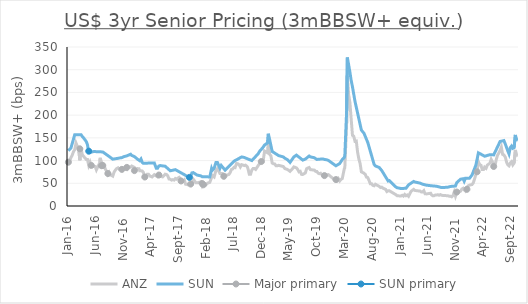
| Category | ANZ | SUN |
|---|---|---|
| 2022-10-13 | 111.5 | 145.5 |
| 2022-10-06 | 112 | 146 |
| 2022-09-29 | 123.5 | 156.5 |
| 2022-09-22 | 94.5 | 128.5 |
| 2022-09-15 | 90.5 | 127 |
| 2022-09-08 | 97.5 | 132 |
| 2022-09-01 | 94.5 | 128.5 |
| 2022-08-25 | 88.5 | 114.5 |
| 2022-08-19 | 90.5 | 120.5 |
| 2022-08-12 | 96.23 | 128.333 |
| 2022-08-05 | 107.235 | 136.167 |
| 2022-07-28 | 112.411 | 144 |
| 2022-07-21 | 113.66 | 143.333 |
| 2022-07-14 | 129.53 | 142.667 |
| 2022-07-07 | 122.306 | 142 |
| 2022-06-30 | 116.43 | 136.1 |
| 2022-06-23 | 111.567 | 130.2 |
| 2022-06-16 | 102.236 | 124.3 |
| 2022-06-09 | 88.68 | 118.4 |
| 2022-06-02 | 89.247 | 112.5 |
| 2022-05-26 | 97.351 | 112.667 |
| 2022-05-19 | 102.64 | 112.833 |
| 2022-05-12 | 94.336 | 113 |
| 2022-05-05 | 92.039 | 112.125 |
| 2022-04-28 | 89.977 | 111.25 |
| 2022-04-21 | 82.906 | 110.375 |
| 2022-04-13 | 85.495 | 109.5 |
| 2022-04-07 | 80.136 | 111 |
| 2022-03-31 | 80.12 | 112.5 |
| 2022-03-24 | 89.747 | 114 |
| 2022-03-17 | 90.981 | 115.5 |
| 2022-03-10 | 97.451 | 117 |
| 2022-03-03 | 77.386 | 103.5 |
| 2022-02-24 | 69.743 | 90 |
| 2022-02-17 | 59.656 | 82.75 |
| 2022-02-10 | 51.031 | 75.5 |
| 2022-02-03 | 47.225 | 68.25 |
| 2022-01-20 | 45.949 | 61 |
| 2022-01-13 | 44.47 | 61 |
| 2022-01-06 | 39.098 | 61 |
| 2021-12-29 | 32.897 | 61 |
| 2021-12-22 | 35.407 | 54.5 |
| 2021-12-16 | 39.077 | 60 |
| 2021-12-09 | 37.412 | 59.5 |
| 2021-12-02 | 32.64 | 59 |
| 2021-11-11 | 29.997 | 51.5 |
| 2021-11-04 | 21.493 | 44 |
| 2021-10-28 | 30.612 | 43.75 |
| 2021-10-21 | 22.809 | 43.5 |
| 2021-10-14 | 20.268 | 43.25 |
| 2021-10-07 | 21.584 | 43 |
| 2021-09-30 | 21.598 | 42.167 |
| 2021-09-23 | 22.561 | 41.333 |
| 2021-08-20 | 23.492 | 40.5 |
| 2021-08-13 | 25.074 | 41.25 |
| 2021-08-06 | 23.649 | 42 |
| 2021-07-30 | 24.726 | 42.75 |
| 2021-07-23 | 24.246 | 43.5 |
| 2021-07-16 | 24.024 | 43.75 |
| 2021-07-09 | 22.764 | 44 |
| 2021-07-02 | 22.481 | 44.25 |
| 2021-06-25 | 24.837 | 44.5 |
| 2021-06-21 | 28.038 | 45.2 |
| 2021-05-28 | 26.635 | 45.9 |
| 2021-05-21 | 26.797 | 46.6 |
| 2021-05-14 | 33.723 | 47.3 |
| 2021-05-07 | 30.733 | 48 |
| 2021-04-30 | 30.996 | 49.2 |
| 2021-04-23 | 32.894 | 50.4 |
| 2021-04-09 | 33.453 | 51.6 |
| 2021-03-26 | 34.278 | 52.8 |
| 2021-03-19 | 36.581 | 54 |
| 2021-03-05 | 32.237 | 50.25 |
| 2021-02-19 | 21.364 | 46.5 |
| 2021-02-12 | 24.185 | 42.75 |
| 2021-02-05 | 22.551 | 39 |
| 2021-01-29 | 25.343 | 38.875 |
| 2021-01-22 | 21.836 | 38.75 |
| 2021-01-15 | 23.517 | 38.625 |
| 2021-01-08 | 21.853 | 38.5 |
| 2020-12-18 | 22.708 | 40.25 |
| 2020-12-11 | 24.951 | 42 |
| 2020-11-06 | 33.43 | 56 |
| 2020-10-30 | 33.501 | 55 |
| 2020-10-23 | 31.836 | 59.6 |
| 2020-10-16 | 36.739 | 64.2 |
| 2020-10-09 | 37.934 | 68.8 |
| 2020-10-02 | 39.058 | 73.4 |
| 2020-09-25 | 41.4 | 78 |
| 2020-09-18 | 40.681 | 81.375 |
| 2020-09-11 | 43.175 | 84.75 |
| 2020-08-21 | 47.86 | 88.125 |
| 2020-08-14 | 44.53 | 91.5 |
| 2020-08-07 | 45.436 | 101.2 |
| 2020-07-31 | 49.094 | 110.9 |
| 2020-07-24 | 49.075 | 120.6 |
| 2020-07-17 | 56.249 | 130.3 |
| 2020-07-10 | 62.584 | 140 |
| 2020-07-03 | 63.613 | 146.75 |
| 2020-06-26 | 69.815 | 153.5 |
| 2020-06-19 | 72.21 | 160.25 |
| 2020-06-05 | 75.121 | 167 |
| 2020-05-29 | 93.327 | 179.6 |
| 2020-05-22 | 103.639 | 192.2 |
| 2020-05-15 | 118.974 | 204.8 |
| 2020-05-08 | 143.024 | 217.4 |
| 2020-05-01 | 142.389 | 230 |
| 2020-04-24 | 153.498 | 246.167 |
| 2020-04-17 | 155.564 | 262.333 |
| 2020-04-09 | 196.23 | 278.5 |
| 2020-04-03 | 227.506 | 294.667 |
| 2020-03-27 | 244.914 | 310.833 |
| 2020-03-20 | 286.298 | 327 |
| 2020-03-16 | 182.746 | 210 |
| 2020-03-06 | 84.379 | 111 |
| 2020-03-03 | 81.771 | 106.625 |
| 2020-02-21 | 60.464 | 102.25 |
| 2020-02-14 | 58.665 | 97.875 |
| 2020-02-07 | 55.168 | 93.5 |
| 2020-01-31 | 59.918 | 91.833 |
| 2020-01-24 | 55.152 | 90.167 |
| 2020-01-17 | 55.512 | 88.5 |
| 2019-12-06 | 69.173 | 100.5 |
| 2019-11-29 | 68.832 | 101.5 |
| 2019-11-15 | 67.488 | 102.5 |
| 2019-11-08 | 65.753 | 103.5 |
| 2019-10-25 | 72.058 | 103.25 |
| 2019-10-18 | 71.11 | 103 |
| 2019-10-11 | 72.348 | 102.75 |
| 2019-10-04 | 76.114 | 102.5 |
| 2019-09-27 | 76.211 | 104.375 |
| 2019-09-20 | 79.042 | 106.25 |
| 2019-08-30 | 80.035 | 108.125 |
| 2019-08-23 | 84.67 | 110 |
| 2019-08-16 | 83.591 | 107.75 |
| 2019-08-09 | 82.035 | 105.5 |
| 2019-08-02 | 72.857 | 103.25 |
| 2019-07-19 | 69.426 | 101 |
| 2019-07-12 | 69.601 | 103.2 |
| 2019-07-05 | 76.269 | 105.4 |
| 2019-06-28 | 75.221 | 107.6 |
| 2019-06-21 | 80.491 | 109.8 |
| 2019-06-14 | 83.879 | 112 |
| 2019-05-31 | 86.092 | 108 |
| 2019-05-24 | 82.434 | 104 |
| 2019-05-17 | 79.151 | 100 |
| 2019-05-10 | 76.311 | 96 |
| 2019-04-26 | 80.352 | 102 |
| 2019-04-12 | 82.233 | 105 |
| 2019-04-03 | 86.911 | 108 |
| 2019-03-08 | 89.5 | 111 |
| 2019-03-01 | 88.5 | 112.8 |
| 2019-02-22 | 88.541 | 114.6 |
| 2019-02-15 | 92.432 | 116.4 |
| 2019-02-08 | 93 | 118.2 |
| 2019-02-01 | 94.5 | 120 |
| 2019-01-25 | 110 | 133 |
| 2019-01-18 | 114.5 | 146 |
| 2019-01-11 | 137 | 159 |
| 2019-01-07 | 117 | 139 |
| 2018-12-21 | 121 | 134.2 |
| 2018-12-13 | 98 | 129.4 |
| 2018-12-03 | 99 | 124.6 |
| 2018-11-23 | 93 | 120 |
| 2018-11-16 | 89 | 115 |
| 2018-11-02 | 80.5 | 109 |
| 2018-10-26 | 82.5 | 106 |
| 2018-10-19 | 82.5 | 103 |
| 2018-10-12 | 79 | 100 |
| 2018-10-05 | 70 | 101.143 |
| 2018-09-28 | 70 | 102.286 |
| 2018-09-21 | 82 | 103.429 |
| 2018-09-17 | 86.5 | 104.571 |
| 2018-09-07 | 90 | 105.714 |
| 2018-08-31 | 89 | 106.857 |
| 2018-08-17 | 91 | 108 |
| 2018-08-10 | 86 | 106.417 |
| 2018-08-03 | 91 | 104.833 |
| 2018-07-27 | 93 | 103.25 |
| 2018-07-20 | 93.5 | 101.667 |
| 2018-07-12 | 84.5 | 100.083 |
| 2018-07-06 | 85 | 98.5 |
| 2018-06-29 | 81.5 | 95.714 |
| 2018-06-22 | 80.5 | 92.929 |
| 2018-06-15 | 73.5 | 90.143 |
| 2018-06-08 | 69.5 | 87.357 |
| 2018-06-01 | 68.5 | 84.571 |
| 2018-05-25 | 68.5 | 81.786 |
| 2018-05-18 | 67 | 79 |
| 2018-05-11 | 68 | 82.4 |
| 2018-05-04 | 71.5 | 85.8 |
| 2018-04-27 | 71.5 | 89.2 |
| 2018-04-20 | 71.5 | 83 |
| 2018-04-06 | 82.5 | 96 |
| 2018-03-29 | 78.5 | 96 |
| 2018-03-19 | 64 | 83.2 |
| 2018-03-09 | 67.5 | 78.5 |
| 2018-03-05 | 63 | 82.5 |
| 2018-02-23 | 52 | 64 |
| 2018-02-12 | 50.5 | 64.125 |
| 2018-02-02 | 47 | 64.25 |
| 2018-01-19 | 51 | 64.375 |
| 2018-01-12 | 45 | 64.5 |
| 2018-01-05 | 53 | 66.3 |
| 2017-12-15 | 51 | 68.1 |
| 2017-12-08 | 51 | 69.9 |
| 2017-12-01 | 55.5 | 71.7 |
| 2017-11-24 | 59 | 73.5 |
| 2017-11-17 | 49.5 | 72.857 |
| 2017-11-10 | 45 | 65 |
| 2017-11-03 | 46.5 | 61.5 |
| 2017-10-27 | 46.5 | 64 |
| 2017-10-20 | 47.5 | 65.667 |
| 2017-10-13 | 48 | 67.333 |
| 2017-10-06 | 57.5 | 69 |
| 2017-09-29 | 55 | 70.571 |
| 2017-09-22 | 56 | 72.143 |
| 2017-09-18 | 56 | 73.714 |
| 2017-09-08 | 63 | 75.286 |
| 2017-09-01 | 61.5 | 76.857 |
| 2017-08-25 | 59 | 78.429 |
| 2017-08-18 | 60.5 | 80 |
| 2017-08-11 | 57 | 79.375 |
| 2017-08-04 | 58 | 78.75 |
| 2017-07-28 | 57 | 78.125 |
| 2017-07-21 | 59 | 77.5 |
| 2017-07-14 | 59.5 | 80 |
| 2017-07-07 | 66.5 | 82.5 |
| 2017-06-30 | 69.5 | 85 |
| 2017-06-23 | 70 | 87.5 |
| 2017-06-16 | 67 | 87.875 |
| 2017-06-09 | 64 | 88.25 |
| 2017-06-02 | 65 | 88.625 |
| 2017-05-26 | 70.5 | 89 |
| 2017-05-19 | 68 | 88 |
| 2017-05-12 | 64.5 | 83 |
| 2017-05-05 | 66 | 83 |
| 2017-04-24 | 69 | 94.889 |
| 2017-04-12 | 64 | 94.778 |
| 2017-04-07 | 64 | 94.667 |
| 2017-03-31 | 66 | 94.556 |
| 2017-03-23 | 70 | 94.444 |
| 2017-03-17 | 70 | 94.333 |
| 2017-03-10 | 63.5 | 94.222 |
| 2017-03-03 | 62.5 | 94.111 |
| 2017-02-23 | 74 | 94 |
| 2017-02-17 | 77 | 95.9 |
| 2017-02-10 | 77.5 | 103.5 |
| 2017-02-03 | 77.5 | 99.7 |
| 2017-01-30 | 82 | 101.6 |
| 2017-01-20 | 82.5 | 103.5 |
| 2017-01-13 | 79 | 106.125 |
| 2017-01-05 | 85 | 108.75 |
| 2016-12-21 | 88 | 111.375 |
| 2016-12-15 | 85.5 | 114 |
| 2016-12-08 | 86 | 112.75 |
| 2016-12-01 | 87 | 111.5 |
| 2016-11-24 | 80 | 110.25 |
| 2016-11-11 | 81 | 109 |
| 2016-11-03 | 80.1 | 107.75 |
| 2016-10-28 | 83 | 106.5 |
| 2016-10-20 | 83 | 106 |
| 2016-10-13 | 81.437 | 105.5 |
| 2016-10-07 | 84 | 105 |
| 2016-09-29 | 82.299 | 104.5 |
| 2016-09-22 | 78.898 | 104 |
| 2016-09-15 | 74.426 | 103.5 |
| 2016-09-08 | 65.782 | 103 |
| 2016-09-01 | 67.406 | 105 |
| 2016-08-26 | 68.506 | 107 |
| 2016-08-19 | 74 | 109 |
| 2016-08-12 | 69.517 | 111 |
| 2016-08-05 | 76.447 | 113 |
| 2016-07-29 | 81.134 | 115 |
| 2016-07-22 | 90.479 | 117 |
| 2016-07-15 | 89 | 119 |
| 2016-07-08 | 96.5 | 119.125 |
| 2016-07-01 | 106 | 119.25 |
| 2016-06-29 | 95.524 | 119.375 |
| 2016-06-17 | 85.5 | 119.5 |
| 2016-06-10 | 79.5 | 119.625 |
| 2016-06-03 | 87 | 119.75 |
| 2016-05-26 | 86.734 | 119.875 |
| 2016-05-23 | 88 | 120 |
| 2016-05-13 | 87.5 | 118.5 |
| 2016-05-06 | 96.432 | 117 |
| 2016-04-29 | 89.5 | 117 |
| 2016-04-22 | 102.5 | 135 |
| 2016-04-15 | 102.561 | 142.2 |
| 2016-04-08 | 106 | 145.9 |
| 2016-04-01 | 109 | 149.6 |
| 2016-03-24 | 113.596 | 153.3 |
| 2016-03-18 | 126.5 | 157 |
| 2016-03-11 | 100.709 | 157 |
| 2016-03-04 | 129 | 157 |
| 2016-02-26 | 131.5 | 157 |
| 2016-02-19 | 138.5 | 157 |
| 2016-02-12 | 124 | 157 |
| 2016-02-05 | 119.5 | 147.167 |
| 2016-01-29 | 111.5 | 137.333 |
| 2016-01-22 | 106.5 | 127.5 |
| 2016-01-15 | 99 | 124.667 |
| 2016-01-08 | 94 | 121.833 |